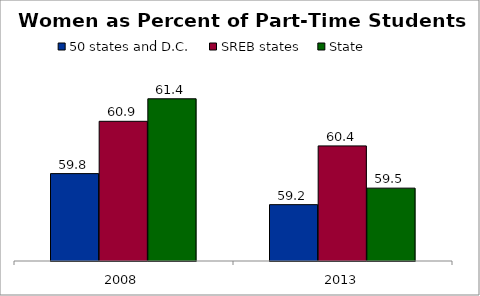
| Category | 50 states and D.C. | SREB states | State |
|---|---|---|---|
| 2008 | 59.83 | 60.925 | 61.397 |
| 2013 | 59.18 | 60.41 | 59.526 |